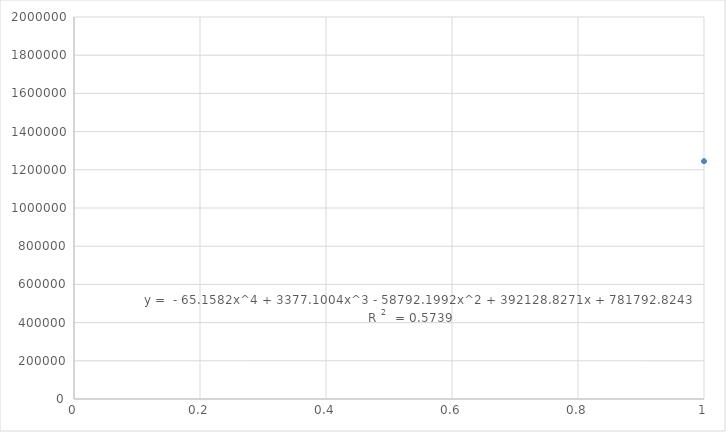
| Category | Series 0 |
|---|---|
| 0 | 1245089 |
| 1 | 1365902 |
| 2 | 1432568 |
| 3 | 1335793 |
| 4 | 1589058 |
| 5 | 1784536 |
| 6 | 1714536 |
| 7 | 1664536 |
| 8 | 1740470 |
| 9 | 1683490 |
| 10 | 1543553 |
| 11 | 1405782 |
| 12 | 1455790 |
| 13 | 1485935 |
| 14 | 1406621 |
| 15 | 1393566 |
| 16 | 1573167 |
| 17 | 1774794 |
| 18 | 1738995 |
| 19 | 1744829 |
| 20 | 1782315 |
| 21 | 1708147 |
| 22 | 1411799 |
| 23 | 1402416 |